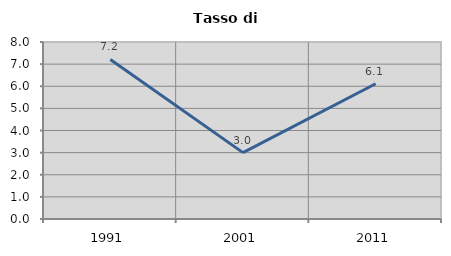
| Category | Tasso di disoccupazione   |
|---|---|
| 1991.0 | 7.212 |
| 2001.0 | 3 |
| 2011.0 | 6.114 |